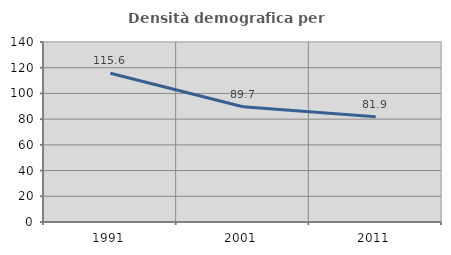
| Category | Densità demografica |
|---|---|
| 1991.0 | 115.638 |
| 2001.0 | 89.693 |
| 2011.0 | 81.881 |